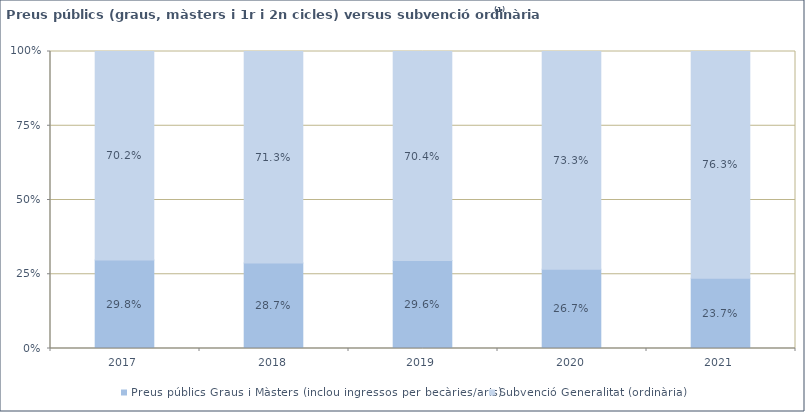
| Category | Preus públics Graus i Màsters (inclou ingressos per becàries/aris) | Subvenció Generalitat (ordinària) |
|---|---|---|
| 2017 | 0.298 | 0.702 |
| 2018 | 0.287 | 0.713 |
| 2019 | 0.296 | 0.704 |
| 2020 | 0.267 | 0.733 |
| 2021 | 0.237 | 0.763 |